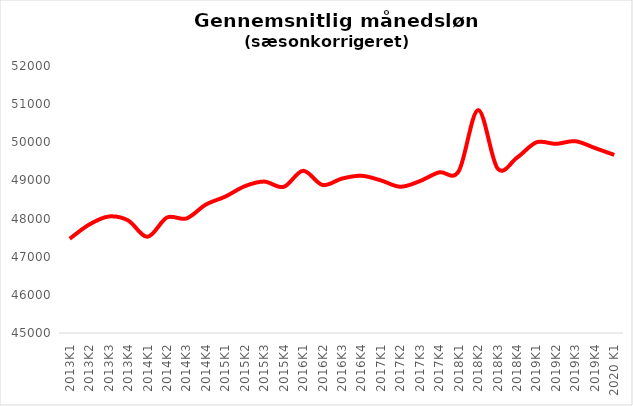
| Category | Series 0 |
|---|---|
| 2013K1 | 47472.342 |
| 2013K2 | 47842.397 |
| 2013K3 | 48053.976 |
| 2013K4 | 47951.469 |
| 2014K1 | 47522.992 |
| 2014K2 | 48026.362 |
| 2014K3 | 48002.998 |
| 2014K4 | 48367.263 |
| 2015K1 | 48576.208 |
| 2015K2 | 48848.638 |
| 2015K3 | 48969.813 |
| 2015K4 | 48830.653 |
| 2016K1 | 49252.567 |
| 2016K2 | 48880.604 |
| 2016K3 | 49049.035 |
| 2016K4 | 49122.238 |
| 2017K1 | 49000.763 |
| 2017K2 | 48834.598 |
| 2017K3 | 48981.029 |
| 2017K4 | 49212.975 |
| 2018K1 | 49240.374 |
| 2018K2 | 50844.093 |
| 2018K3 | 49313.613 |
| 2018K4 | 49596.78 |
| 2019K1 | 49999.143 |
| 2019K2 | 49958.678 |
| 2019K3 | 50028.156 |
| 2019K4 | 49850.753 |
| 2020 K1 | 49669.216 |